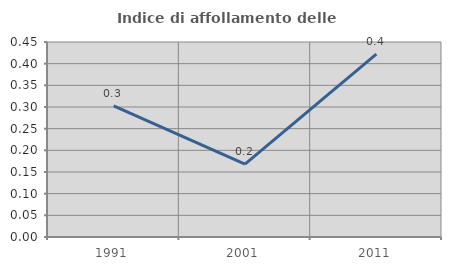
| Category | Indice di affollamento delle abitazioni  |
|---|---|
| 1991.0 | 0.302 |
| 2001.0 | 0.168 |
| 2011.0 | 0.422 |